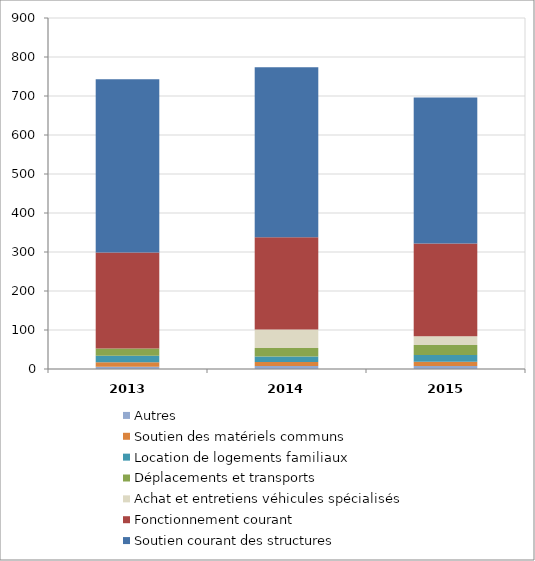
| Category | Autres | Soutien des matériels communs | Location de logements familiaux | Déplacements et transports | Achat et entretiens véhicules spécialisés | Fonctionnement courant | Soutien courant des structures |
|---|---|---|---|---|---|---|---|
| 2013.0 | 5.8 | 11.4 | 16.7 | 18.5 | 0 | 246 | 444.7 |
| 2014.0 | 7.6 | 10.1 | 14.3 | 21.8 | 47.4 | 236.9 | 435.3 |
| 2015.0 | 7.6 | 11.3 | 16.8 | 25.9 | 22.2 | 237.9 | 374.5 |